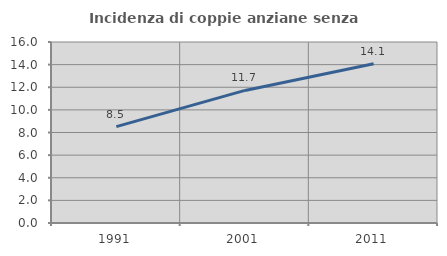
| Category | Incidenza di coppie anziane senza figli  |
|---|---|
| 1991.0 | 8.523 |
| 2001.0 | 11.719 |
| 2011.0 | 14.069 |